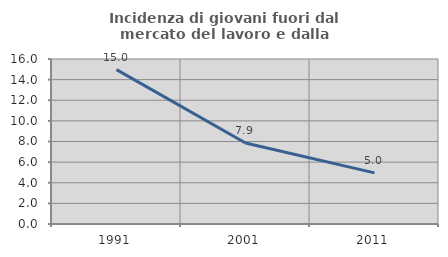
| Category | Incidenza di giovani fuori dal mercato del lavoro e dalla formazione  |
|---|---|
| 1991.0 | 14.966 |
| 2001.0 | 7.857 |
| 2011.0 | 4.959 |